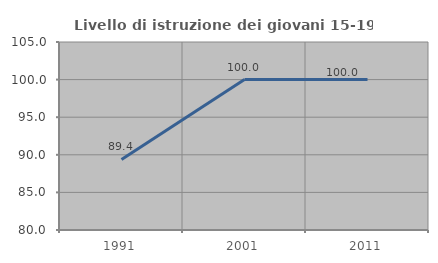
| Category | Livello di istruzione dei giovani 15-19 anni |
|---|---|
| 1991.0 | 89.381 |
| 2001.0 | 100 |
| 2011.0 | 100 |